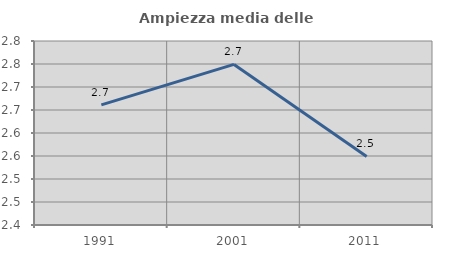
| Category | Ampiezza media delle famiglie |
|---|---|
| 1991.0 | 2.661 |
| 2001.0 | 2.749 |
| 2011.0 | 2.549 |